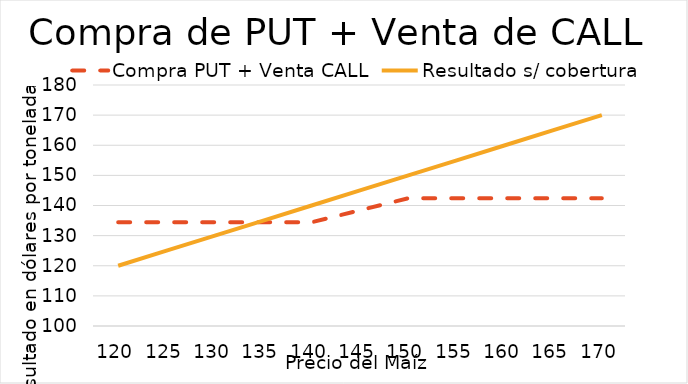
| Category | Compra PUT + Venta CALL | Resultado s/ cobertura |
|---|---|---|
| 120.0 | 134.43 | 120 |
| 125.0 | 134.43 | 125 |
| 130.0 | 134.43 | 130 |
| 135.0 | 134.43 | 135 |
| 140.0 | 134.43 | 140 |
| 145.0 | 138.43 | 145 |
| 150.0 | 142.43 | 150 |
| 155.0 | 142.43 | 155 |
| 160.0 | 142.43 | 160 |
| 165.0 | 142.43 | 165 |
| 170.0 | 142.43 | 170 |